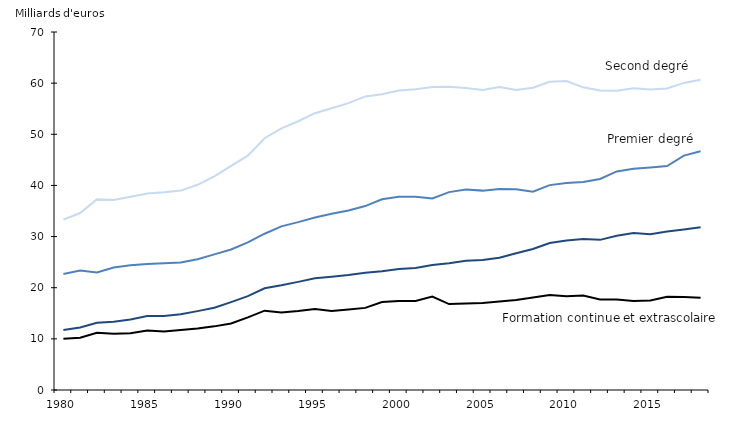
| Category | Premier degré | Second degré | Supérieur | Formation continue et extrascolaire |
|---|---|---|---|---|
| 1980 | 22.671 | 33.319 | 11.752 | 10.001 |
| 1981 | 23.36 | 34.6 | 12.212 | 10.212 |
| 1982 | 22.998 | 37.271 | 13.14 | 11.202 |
| 1983 | 23.952 | 37.142 | 13.323 | 10.989 |
| 1984 | 24.39 | 37.777 | 13.775 | 11.104 |
| 1985 | 24.658 | 38.415 | 14.455 | 11.644 |
| 1986 | 24.789 | 38.648 | 14.473 | 11.417 |
| 1987 | 24.93 | 38.993 | 14.801 | 11.732 |
| 1988 | 25.584 | 40.123 | 15.422 | 12.041 |
| 1989 | 26.526 | 41.757 | 16.095 | 12.444 |
| 1990 | 27.485 | 43.817 | 17.19 | 13.014 |
| 1991 | 28.874 | 45.83 | 18.343 | 14.211 |
| 1992 | 30.558 | 49.236 | 19.885 | 15.513 |
| 1993 | 31.994 | 51.156 | 20.465 | 15.137 |
| 1994 | 32.821 | 52.554 | 21.139 | 15.455 |
| 1995 | 33.738 | 54.129 | 21.845 | 15.851 |
| 1996 | 34.467 | 55.096 | 22.129 | 15.469 |
| 1997 | 35.093 | 56.096 | 22.48 | 15.736 |
| 1998 | 35.964 | 57.409 | 22.937 | 16.055 |
| 1999 | 37.288 | 57.833 | 23.203 | 17.215 |
| 2000 | 37.781 | 58.573 | 23.647 | 17.381 |
| 2001 | 37.773 | 58.786 | 23.855 | 17.389 |
| 2002 | 37.456 | 59.228 | 24.453 | 18.277 |
| 2003 | 38.688 | 59.283 | 24.8 | 16.795 |
| 2004 | 39.195 | 59.062 | 25.258 | 16.927 |
| 2005 | 38.984 | 58.657 | 25.433 | 17.034 |
| 2006 | 39.312 | 59.257 | 25.876 | 17.302 |
| 2007 | 39.238 | 58.646 | 26.741 | 17.614 |
| 2008 | 38.772 | 59.105 | 27.565 | 18.076 |
| 2009 | 40.063 | 60.268 | 28.744 | 18.597 |
| 2010 | 40.456 | 60.426 | 29.238 | 18.344 |
| 2011 | 40.68 | 59.183 | 29.534 | 18.462 |
| 2012 | 41.267 | 58.552 | 29.358 | 17.708 |
| 2013 | 42.745 | 58.493 | 30.166 | 17.679 |
| 2014 | 43.255 | 59.007 | 30.681 | 17.392 |
| 2015 | 43.491 | 58.772 | 30.456 | 17.523 |
| 2016 | 43.789 | 58.951 | 30.976 | 18.221 |
| 2017 | 45.836 | 60.047 | 31.371 | 18.205 |
| 2018p | 46.668 | 60.657 | 31.832 | 18.061 |